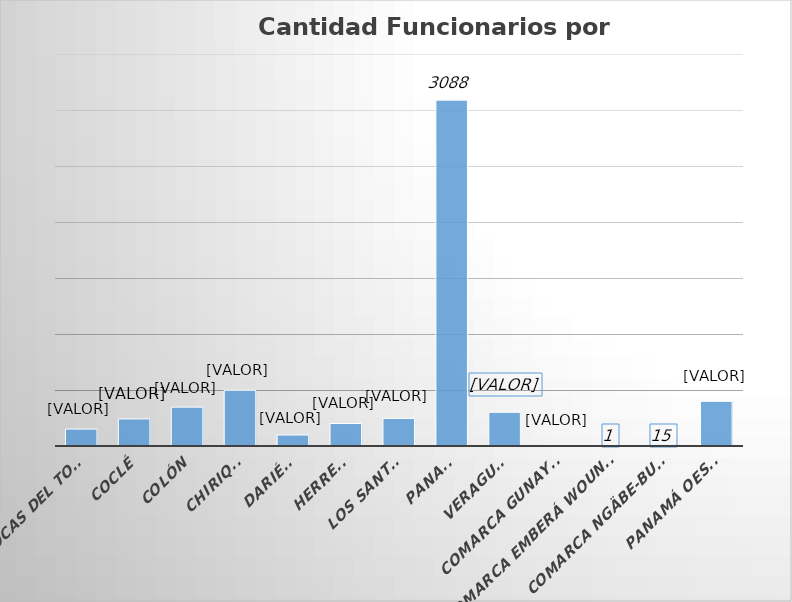
| Category | Cantidad  |
|---|---|
| BOCAS DEL TORO | 151 |
| COCLÉ | 242 |
| COLÓN | 347 |
| CHIRIQUÍ | 498 |
| DARIÉN | 98 |
| HERRERA | 201 |
| LOS SANTOS | 246 |
| PANAMÁ | 3088 |
| VERAGUAS | 301 |
| COMARCA GUNAYALA | 7 |
| COMARCA EMBERÁ WOUNAAN | 1 |
| COMARCA NGÄBE-BUGLÉ | 15 |
| PANAMÁ OESTE | 399 |